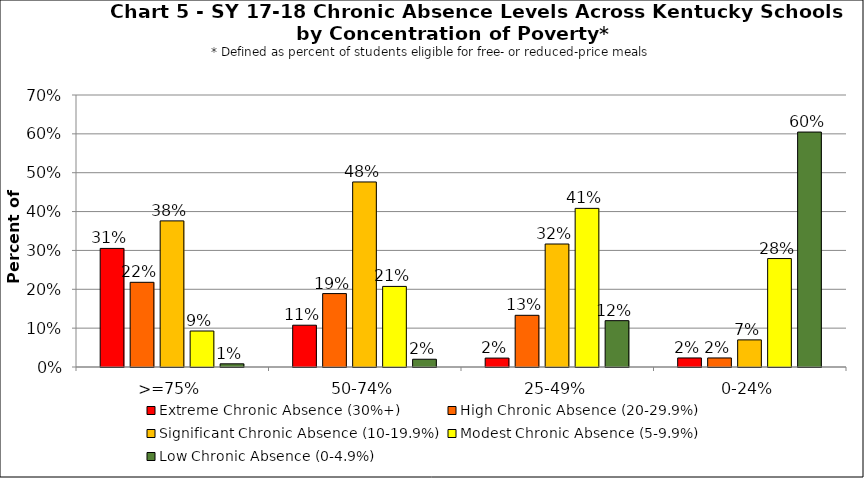
| Category | Extreme Chronic Absence (30%+) | High Chronic Absence (20-29.9%) | Significant Chronic Absence (10-19.9%) | Modest Chronic Absence (5-9.9%) | Low Chronic Absence (0-4.9%) |
|---|---|---|---|---|---|
| 0 | 0.305 | 0.218 | 0.376 | 0.093 | 0.008 |
| 1 | 0.108 | 0.189 | 0.476 | 0.207 | 0.02 |
| 2 | 0.023 | 0.133 | 0.317 | 0.408 | 0.119 |
| 3 | 0.023 | 0.023 | 0.07 | 0.279 | 0.605 |